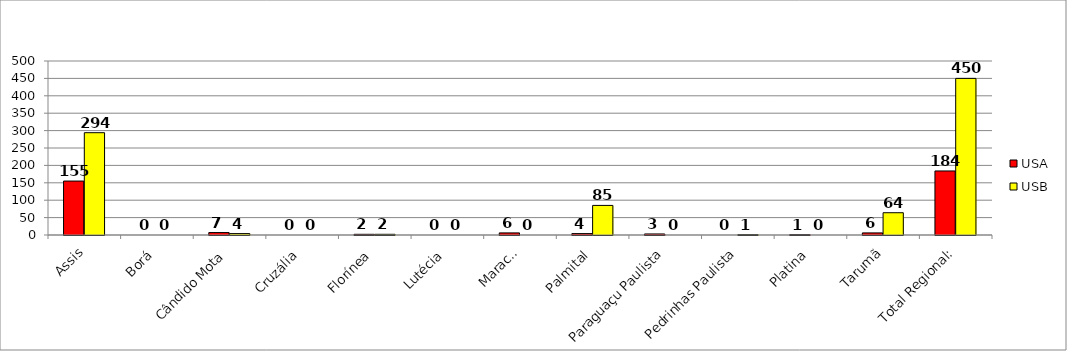
| Category | USA | USB |
|---|---|---|
| Assis | 155 | 294 |
| Borá | 0 | 0 |
| Cândido Mota | 7 | 4 |
| Cruzália | 0 | 0 |
| Florínea | 2 | 2 |
| Lutécia | 0 | 0 |
| Maracaí | 6 | 0 |
| Palmital | 4 | 85 |
| Paraguaçu Paulista | 3 | 0 |
| Pedrinhas Paulista | 0 | 1 |
| Platina | 1 | 0 |
| Tarumã | 6 | 64 |
| Total Regional: | 184 | 450 |